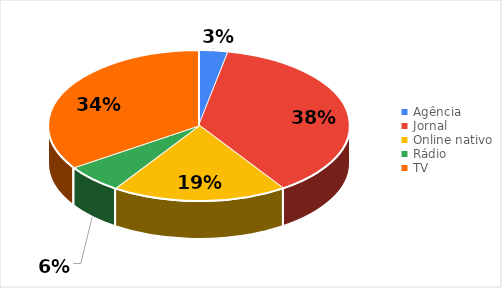
| Category | Total |
|---|---|
| Agência | 1 |
| Jornal | 12 |
| Online nativo | 6 |
| Rádio | 2 |
| TV | 11 |